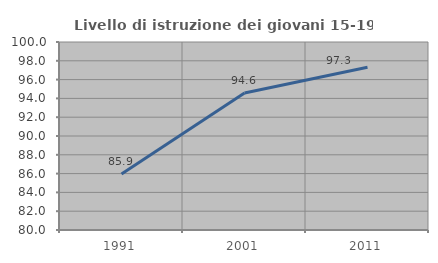
| Category | Livello di istruzione dei giovani 15-19 anni |
|---|---|
| 1991.0 | 85.948 |
| 2001.0 | 94.565 |
| 2011.0 | 97.315 |